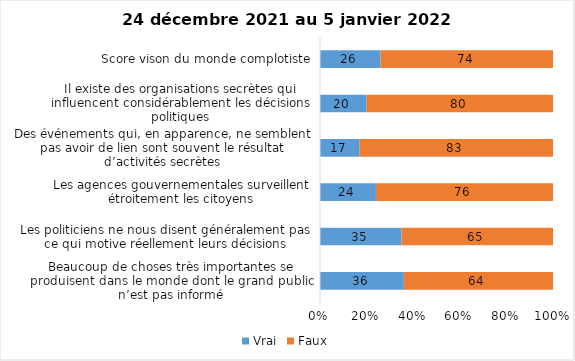
| Category | Vrai | Faux |
|---|---|---|
| Beaucoup de choses très importantes se produisent dans le monde dont le grand public n’est pas informé | 36 | 64 |
| Les politiciens ne nous disent généralement pas ce qui motive réellement leurs décisions | 35 | 65 |
| Les agences gouvernementales surveillent étroitement les citoyens | 24 | 76 |
| Des événements qui, en apparence, ne semblent pas avoir de lien sont souvent le résultat d’activités secrètes | 17 | 83 |
| Il existe des organisations secrètes qui influencent considérablement les décisions politiques | 20 | 80 |
| Score vison du monde complotiste | 26 | 74 |